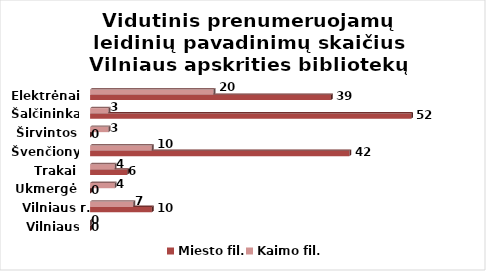
| Category | Miesto fil. | Kaimo fil. |
|---|---|---|
| Vilniaus m. | 0 | 0 |
| Vilniaus r. | 10 | 7 |
| Ukmergė | 0 | 4 |
| Trakai | 6 | 4 |
| Švenčionys | 42 | 10 |
| Širvintos | 0 | 3 |
| Šalčininkai | 52 | 3 |
| Elektrėnai | 39 | 20 |